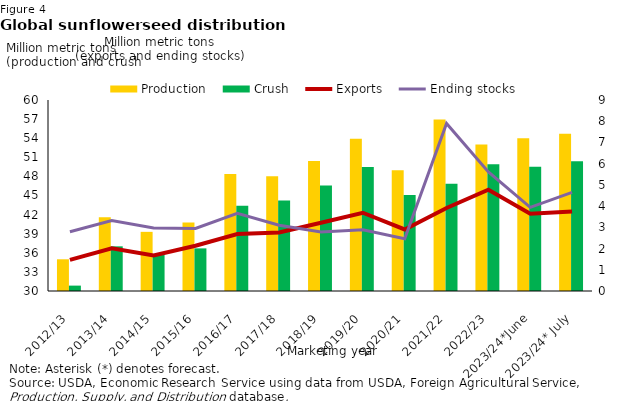
| Category | Production | Crush |
|---|---|---|
| 2012/13 | 34.981 | 30.846 |
| 2013/14 | 41.571 | 37.015 |
| 2014/15 | 39.291 | 35.704 |
| 2015/16 | 40.755 | 36.695 |
| 2016/17 | 48.395 | 43.378 |
| 2017/18 | 48.012 | 44.217 |
| 2018/19 | 50.415 | 46.57 |
| 2019/20 | 53.895 | 49.485 |
| 2020/21 | 48.947 | 45.063 |
| 2021/22 | 56.953 | 46.836 |
| 2022/23 | 53.025 | 49.89 |
| 2023/24*June | 54.01 | 49.52 |
| 2023/24* July | 54.691 | 50.37 |